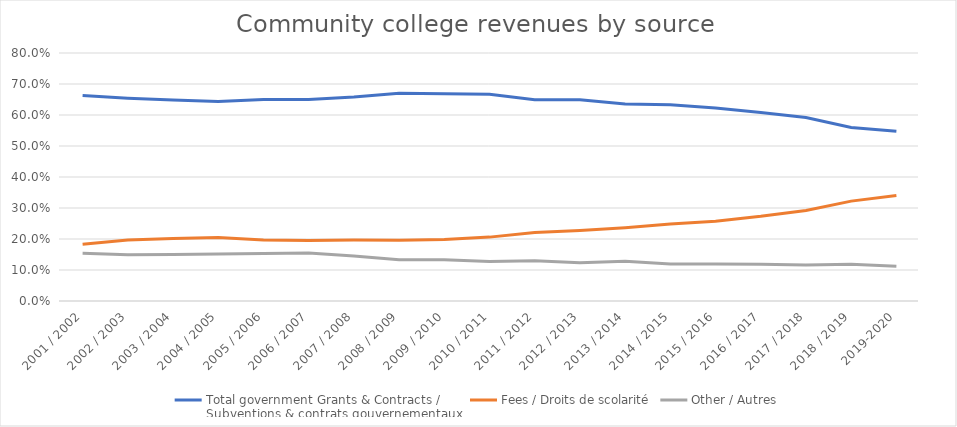
| Category | Total government Grants & Contracts / 
Subventions & contrats gouvernementaux | Fees / Droits de scolarité | Other / Autres |
|---|---|---|---|
| 2001 / 2002 | 0.663 | 0.183 | 0.154 |
| 2002 / 2003 | 0.654 | 0.196 | 0.149 |
| 2003 / 2004 | 0.648 | 0.201 | 0.15 |
| 2004 / 2005 | 0.644 | 0.205 | 0.151 |
| 2005 / 2006 | 0.65 | 0.197 | 0.153 |
| 2006 / 2007 | 0.65 | 0.195 | 0.155 |
| 2007 / 2008 | 0.658 | 0.197 | 0.145 |
| 2008 / 2009 | 0.67 | 0.196 | 0.133 |
| 2009 / 2010 | 0.669 | 0.199 | 0.133 |
| 2010 / 2011 | 0.667 | 0.206 | 0.127 |
| 2011 / 2012 | 0.649 | 0.221 | 0.13 |
| 2012 / 2013 | 0.649 | 0.228 | 0.123 |
| 2013 / 2014 | 0.635 | 0.237 | 0.128 |
| 2014 / 2015 | 0.633 | 0.248 | 0.119 |
| 2015 / 2016 | 0.623 | 0.258 | 0.119 |
| 2016 / 2017 | 0.608 | 0.273 | 0.119 |
| 2017 / 2018 | 0.592 | 0.292 | 0.117 |
| 2018 / 2019 | 0.56 | 0.322 | 0.118 |
| 2019-2020 | 0.547 | 0.341 | 0.112 |